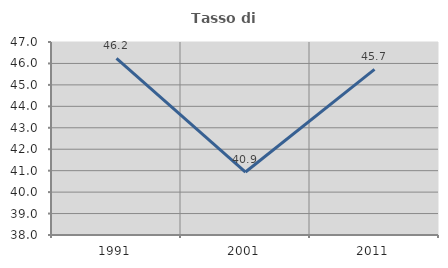
| Category | Tasso di occupazione   |
|---|---|
| 1991.0 | 46.237 |
| 2001.0 | 40.936 |
| 2011.0 | 45.72 |